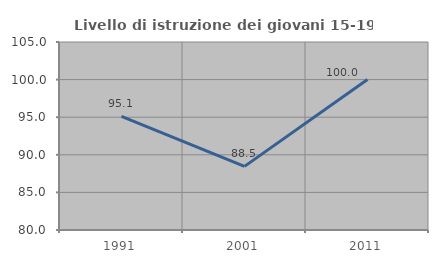
| Category | Livello di istruzione dei giovani 15-19 anni |
|---|---|
| 1991.0 | 95.122 |
| 2001.0 | 88.462 |
| 2011.0 | 100 |